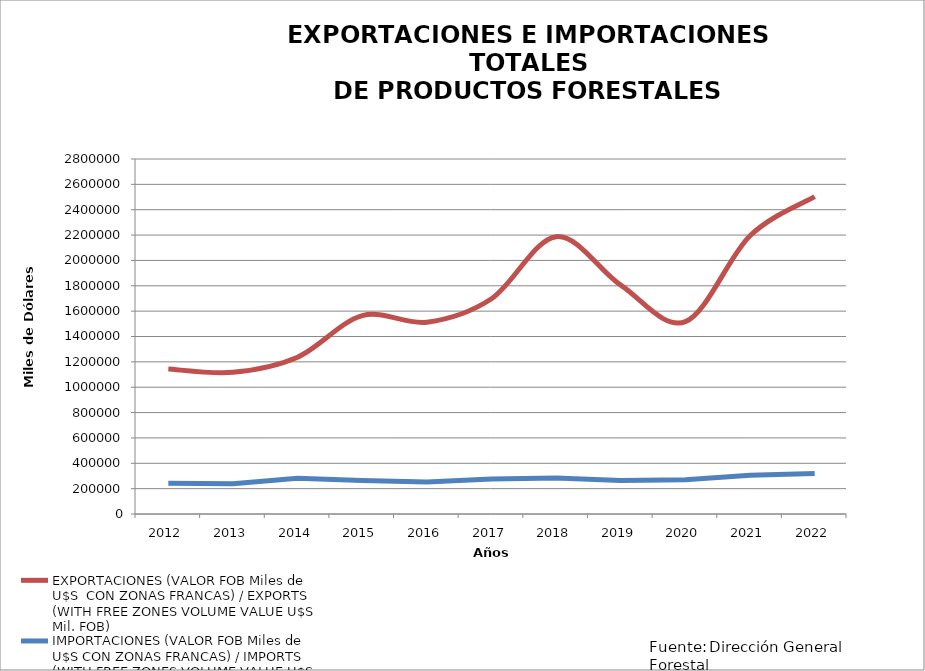
| Category | EXPORTACIONES (VALOR FOB Miles de U$S  CON ZONAS FRANCAS) / EXPORTS (WITH FREE ZONES VOLUME VALUE U$S Mil. FOB) | IMPORTACIONES (VALOR FOB Miles de U$S CON ZONAS FRANCAS) / IMPORTS (WITH FREE ZONES VOLUME VALUE U$S Mill. FOB) |
|---|---|---|
| 2012.0 | 1143485.85 | 242778.502 |
| 2013.0 | 1117961.004 | 238311.369 |
| 2014.0 | 1236849.234 | 281162.464 |
| 2015.0 | 1564529.97 | 265180.303 |
| 2016.0 | 1512855.911 | 252240.473 |
| 2017.0 | 1697667.265 | 275664.327 |
| 2018.0 | 2187564.243 | 284322.493 |
| 2019.0 | 1804711.611 | 264473.337 |
| 2020.0 | 1517099.022 | 269601.315 |
| 2021.0 | 2194748.925 | 304916.791 |
| 2022.0 | 2503324.775 | 318930.117 |